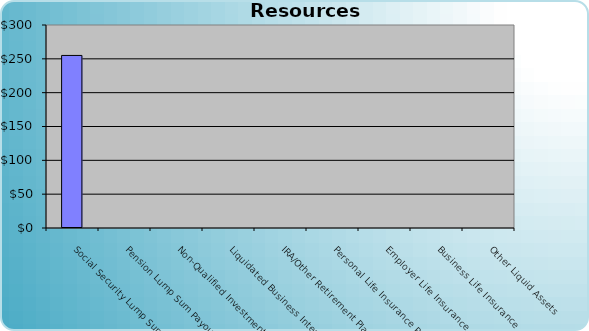
| Category | Series 0 |
|---|---|
| Social Security Lump Sum ($225) | 255 |
| Pension Lump Sum Payouts | 0 |
| Non-Qualified Investments | 0 |
| Liquidated Business Interests | 0 |
| IRA/Other Retirement Plans | 0 |
| Personal Life Insurance Policies | 0 |
| Employer Life Insurance | 0 |
| Business Life Insurance | 0 |
| Other Liquid Assets | 0 |